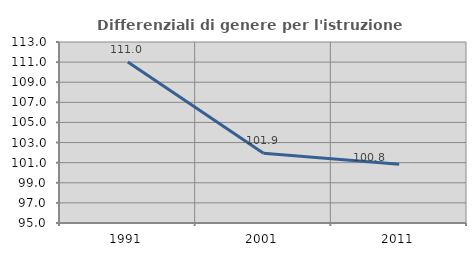
| Category | Differenziali di genere per l'istruzione superiore |
|---|---|
| 1991.0 | 111.016 |
| 2001.0 | 101.945 |
| 2011.0 | 100.834 |